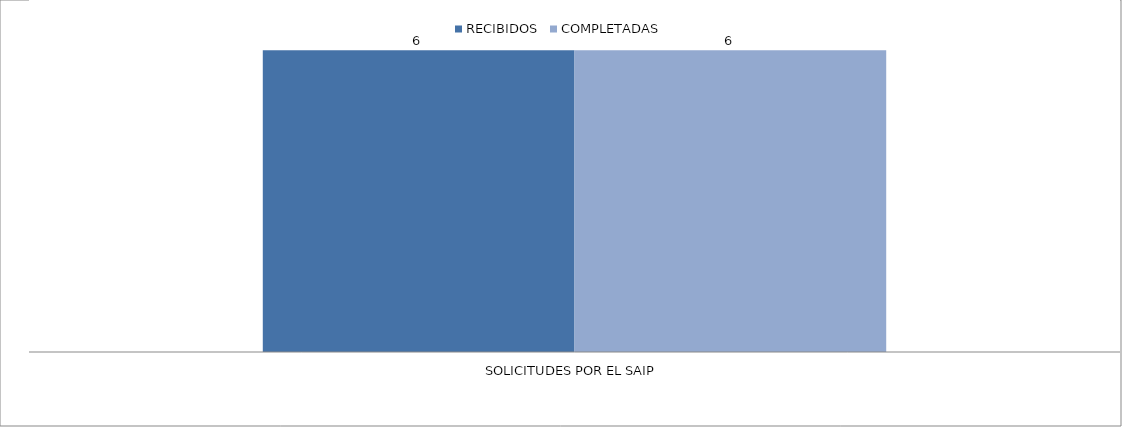
| Category | RECIBIDOS | COMPLETADAS |
|---|---|---|
| SOLICITUDES POR EL SAIP | 6 | 6 |